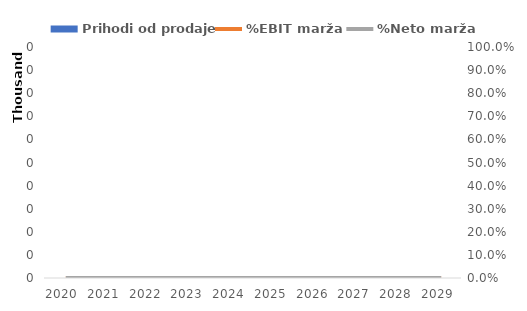
| Category | Prihodi od prodaje |
|---|---|
| 2020.0 | 0 |
| 2021.0 | 0 |
| 2022.0 | 0 |
| 2023.0 | 0 |
| 2024.0 | 0 |
| 2025.0 | 0 |
| 2026.0 | 0 |
| 2027.0 | 0 |
| 2028.0 | 0 |
| 2029.0 | 0 |